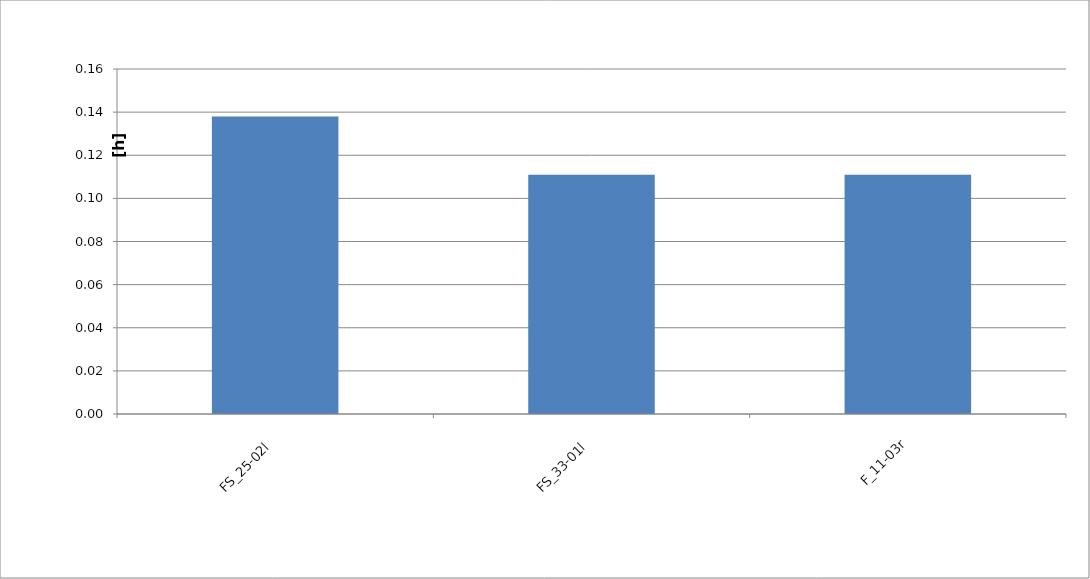
| Category | Series 0 |
|---|---|
| FS_25-02l | 0.138 |
| FS_33-01l | 0.111 |
| F_11-03r | 0.111 |